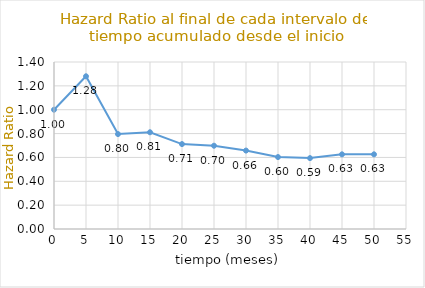
| Category | HRi |
|---|---|
| 0.0 | 1 |
| 5.0 | 1.28 |
| 10.0 | 0.796 |
| 15.0 | 0.811 |
| 20.0 | 0.712 |
| 25.0 | 0.698 |
| 30.0 | 0.657 |
| 35.0 | 0.603 |
| 40.0 | 0.594 |
| 45.0 | 0.626 |
| 50.0 | 0.626 |